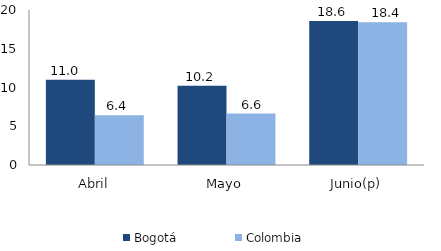
| Category | Bogotá | Colombia |
|---|---|---|
| Abril | 10.994 | 6.426 |
| Mayo | 10.241 | 6.631 |
| Junio(p) | 18.581 | 18.414 |